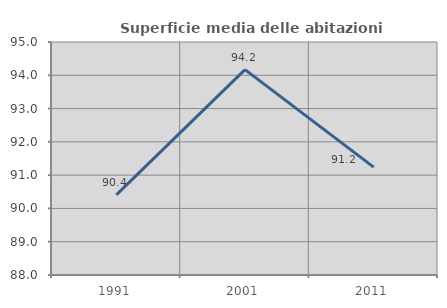
| Category | Superficie media delle abitazioni occupate |
|---|---|
| 1991.0 | 90.405 |
| 2001.0 | 94.172 |
| 2011.0 | 91.241 |